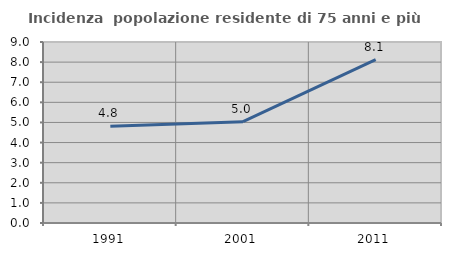
| Category | Incidenza  popolazione residente di 75 anni e più |
|---|---|
| 1991.0 | 4.809 |
| 2001.0 | 5.036 |
| 2011.0 | 8.12 |